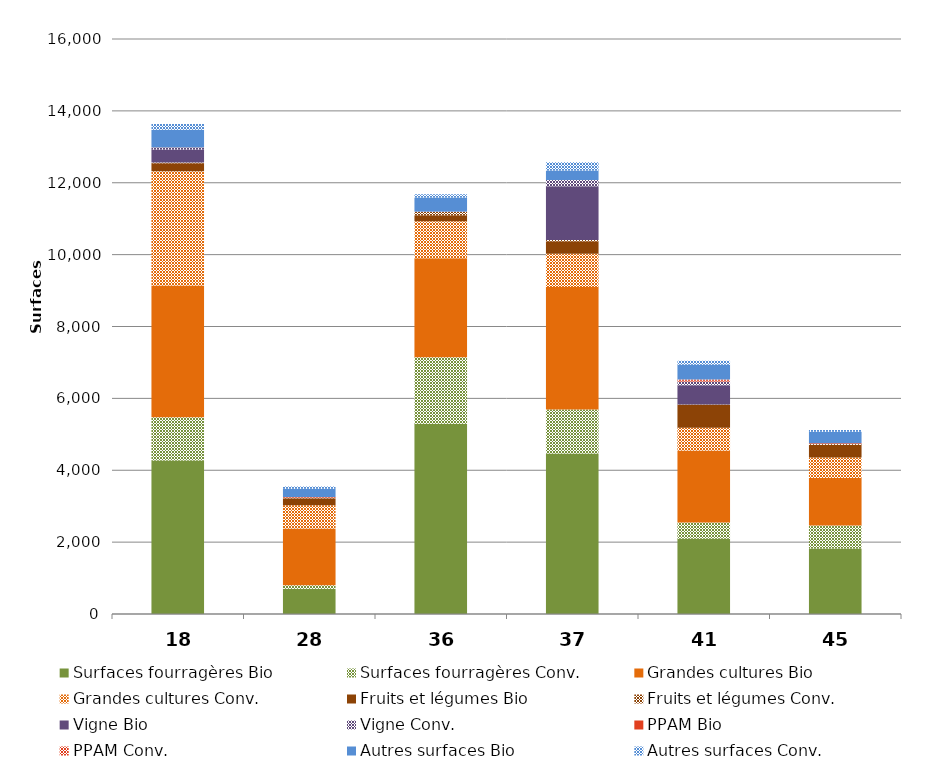
| Category | Surfaces fourragères Bio | Surfaces fourragères Conv. | Grandes cultures Bio | Grandes cultures Conv. | Fruits et légumes Bio | Fruits et légumes Conv. | Vigne Bio | Vigne Conv. | PPAM Bio | PPAM Conv. | Autres surfaces Bio | Autres surfaces Conv. |
|---|---|---|---|---|---|---|---|---|---|---|---|---|
| 18 | 4273.259 | 1198.8 | 3670.88 | 3178.19 | 222.885 | 18.94 | 363.359 | 44.79 | 11.66 | 0 | 493.783 | 160.62 |
| 28 | 705.36 | 94.82 | 1580.85 | 648.48 | 193.818 | 11.24 | 0 | 0 | 17.39 | 3.92 | 229.662 | 63.7 |
| 36 | 5294.712 | 1848.24 | 2755.51 | 1031.42 | 168.664 | 86.66 | 5.65 | 5.89 | 5.59 | 0 | 384.228 | 94.24 |
| 37 | 4466.9 | 1223.49 | 3408.76 | 924.92 | 348.894 | 35.823 | 1490.953 | 173.557 | 1.87 | 1.22 | 262.681 | 230.049 |
| 41 | 2094.836 | 454.56 | 1997.1 | 636.97 | 640.67 | 8.4 | 534.87 | 104.826 | 21.08 | 30.39 | 409.597 | 113.18 |
| 45 | 1822.352 | 642.862 | 1321.34 | 567.62 | 354.745 | 22.872 | 0 | 0 | 19.32 | 0 | 320.064 | 49.48 |